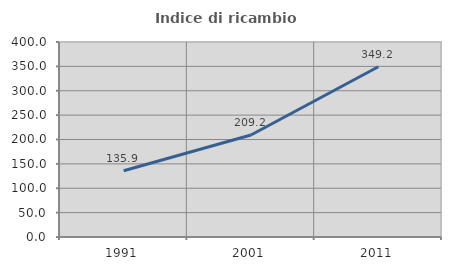
| Category | Indice di ricambio occupazionale  |
|---|---|
| 1991.0 | 135.866 |
| 2001.0 | 209.198 |
| 2011.0 | 349.22 |